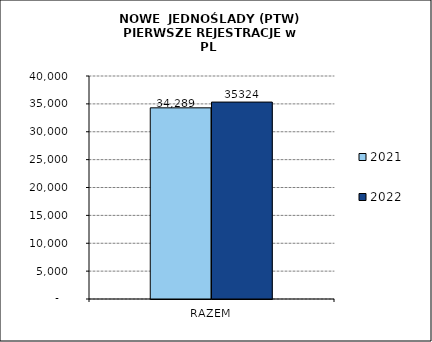
| Category | 2021 | 2022 |
|---|---|---|
| RAZEM | 34289 | 35324 |